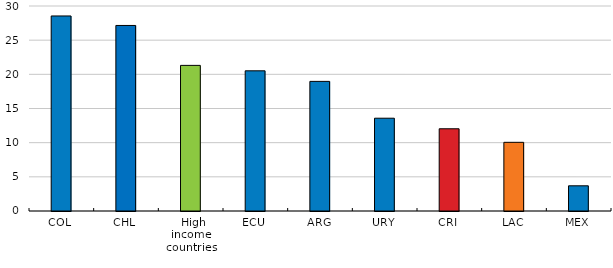
| Category | 2019 |
|---|---|
| COL | 28.543 |
| CHL | 27.151 |
|  High income countries | 21.309 |
| ECU | 20.514 |
| ARG | 18.967 |
| URY | 13.578 |
| CRI | 12.034 |
| LAC | 10.051 |
| MEX | 3.688 |